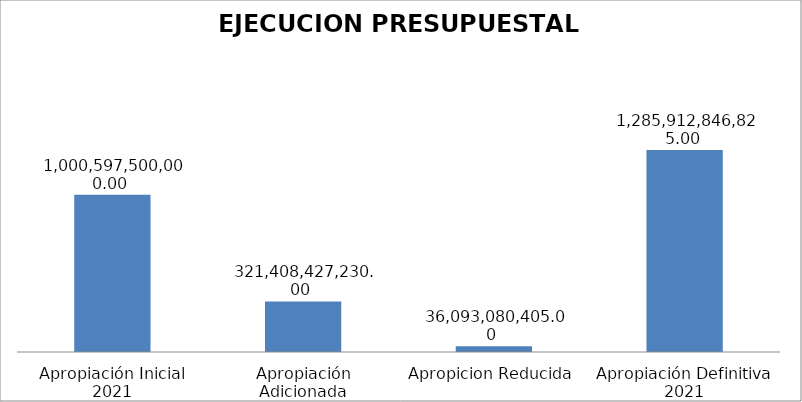
| Category | Series 0 |
|---|---|
| Apropiación Inicial 2021 | 1000597500000 |
| Apropiación Adicionada | 321408427230 |
| Apropicion Reducida | 36093080405 |
| Apropiación Definitiva 2021 | 1285912846825 |